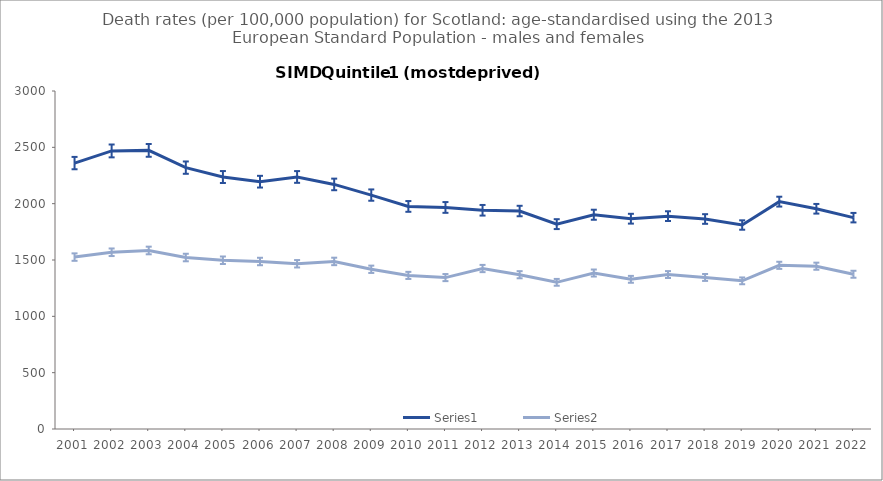
| Category | Series 0 | Series 1 |
|---|---|---|
| 2001.0 | 2360.2 | 1525.8 |
| 2002.0 | 2468.1 | 1568.7 |
| 2003.0 | 2473 | 1584.5 |
| 2004.0 | 2319.8 | 1522 |
| 2005.0 | 2236.5 | 1497.9 |
| 2006.0 | 2195.1 | 1486.7 |
| 2007.0 | 2237 | 1466.6 |
| 2008.0 | 2170.8 | 1487.3 |
| 2009.0 | 2076.2 | 1417.6 |
| 2010.0 | 1975.5 | 1363.3 |
| 2011.0 | 1966.4 | 1343.9 |
| 2012.0 | 1941.4 | 1424.4 |
| 2013.0 | 1934.7 | 1369.3 |
| 2014.0 | 1818.4 | 1301.8 |
| 2015.0 | 1901.7 | 1384.4 |
| 2016.0 | 1866.5 | 1328.5 |
| 2017.0 | 1889.3 | 1370.7 |
| 2018.0 | 1863.9 | 1345 |
| 2019.0 | 1810.5 | 1315 |
| 2020.0 | 2018 | 1452.8 |
| 2021.0 | 1954.7 | 1444.9 |
| 2022.0 | 1875.8 | 1373.5 |